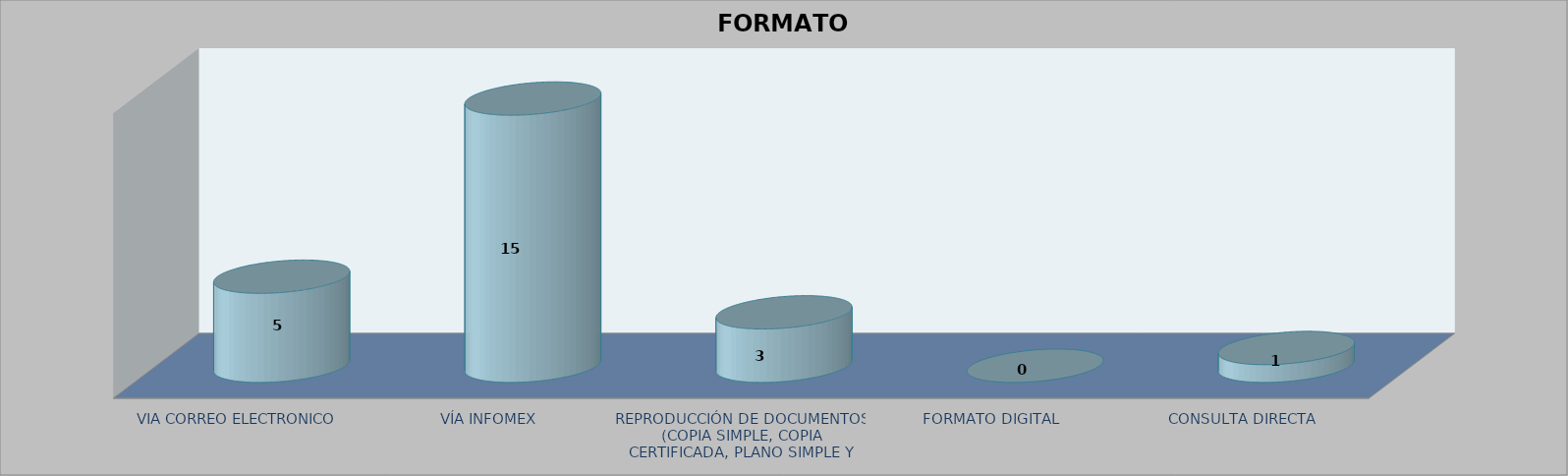
| Category |        FORMATO SOLICITADO | Series 1 | Series 2 |
|---|---|---|---|
| VIA CORREO ELECTRONICO |  |  | 5 |
| VÍA INFOMEX |  |  | 15 |
| REPRODUCCIÓN DE DOCUMENTOS (COPIA SIMPLE, COPIA CERTIFICADA, PLANO SIMPLE Y PLANO CERTIFICADO) |  |  | 3 |
| FORMATO DIGITAL |  |  | 0 |
| CONSULTA DIRECTA |  |  | 1 |